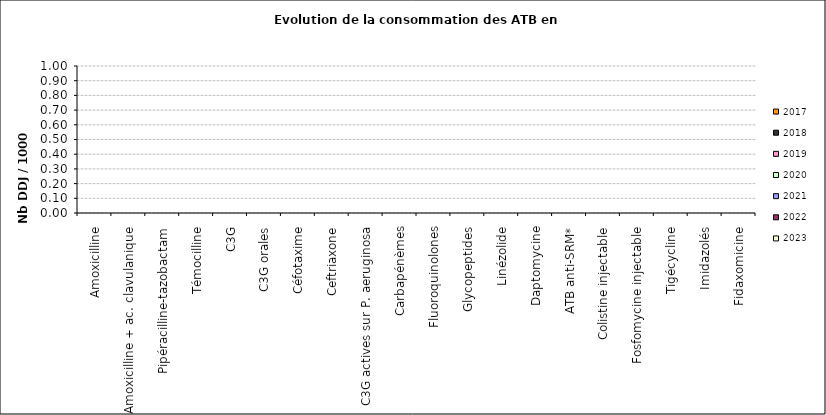
| Category | 2017 | 2018 | 2019 | 2020 | 2021 | 2022 | 2023 |
|---|---|---|---|---|---|---|---|
| Amoxicilline |  |  |  |  |  |  | 0 |
| Amoxicilline + ac. clavulanique |  |  |  |  |  |  | 0 |
| Pipéracilline-tazobactam |  |  |  |  |  |  | 0 |
| Témocilline |  |  |  |  |  |  | 0 |
| C3G |  |  |  |  |  |  | 0 |
| C3G orales |  |  |  |  |  |  | 0 |
| Céfotaxime |  |  |  |  |  |  | 0 |
| Ceftriaxone |  |  |  |  |  |  | 0 |
| C3G actives sur P. aeruginosa |  |  |  |  |  |  | 0 |
| Carbapénèmes |  |  |  |  |  |  | 0 |
| Fluoroquinolones |  |  |  |  |  |  | 0 |
| Glycopeptides |  |  |  |  |  |  | 0 |
| Linézolide |  |  |  |  |  |  | 0 |
| Daptomycine |  |  |  |  |  |  | 0 |
| ATB anti-SRM* |  |  |  |  |  |  | 0 |
| Colistine injectable |  |  |  |  |  |  | 0 |
| Fosfomycine injectable |  |  |  |  |  |  | 0 |
| Tigécycline |  |  |  |  |  |  | 0 |
| Imidazolés |  |  |  |  |  |  | 0 |
| Fidaxomicine |  |  |  |  |  |  | 0 |